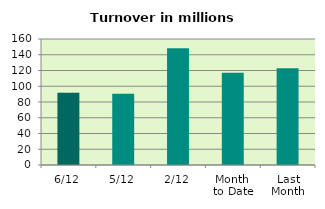
| Category | Series 0 |
|---|---|
| 6/12 | 91.816 |
| 5/12 | 90.403 |
| 2/12 | 148.363 |
| Month 
to Date | 117.261 |
| Last
Month | 122.873 |